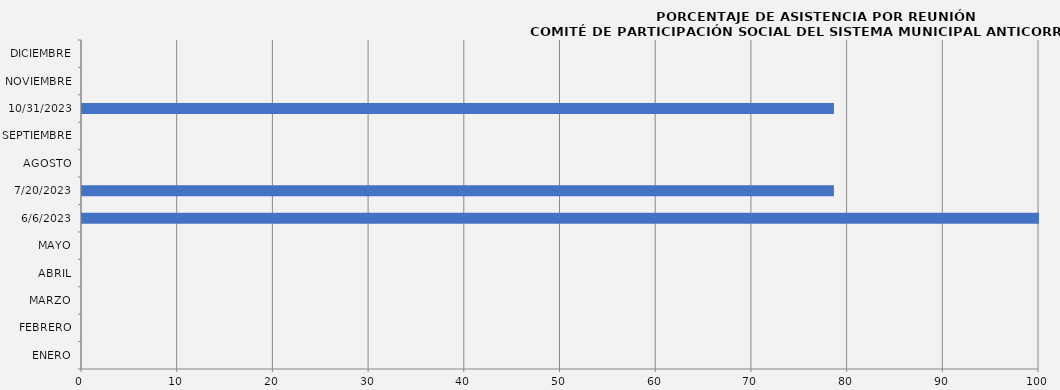
| Category | Series 0 |
|---|---|
| ENERO | 0 |
| FEBRERO | 0 |
| MARZO | 0 |
| ABRIL | 0 |
| MAYO | 0 |
| 06/06/2023 | 100 |
| 20/07/2023 | 78.571 |
| AGOSTO | 0 |
| SEPTIEMBRE | 0 |
| 31/10/2023 | 78.571 |
| NOVIEMBRE | 0 |
| DICIEMBRE | 0 |